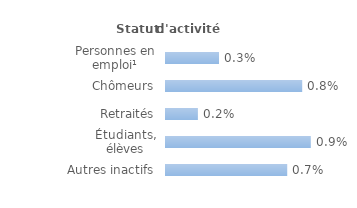
| Category | Series 0 |
|---|---|
| Personnes en emploi¹ | 0.003 |
| Chômeurs | 0.008 |
| Retraités | 0.002 |
| Étudiants, élèves | 0.009 |
| Autres inactifs  | 0.007 |